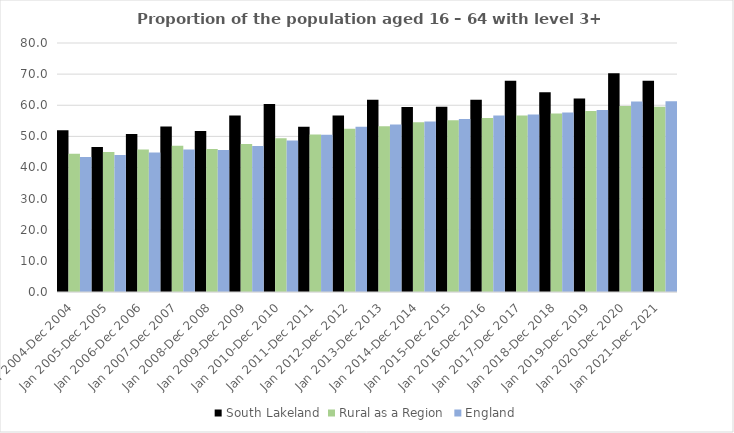
| Category | South Lakeland | Rural as a Region | England |
|---|---|---|---|
| Jan 2004-Dec 2004 | 52 | 44.405 | 43.4 |
| Jan 2005-Dec 2005 | 46.6 | 44.973 | 44 |
| Jan 2006-Dec 2006 | 50.8 | 45.774 | 44.8 |
| Jan 2007-Dec 2007 | 53.2 | 46.968 | 45.8 |
| Jan 2008-Dec 2008 | 51.7 | 45.964 | 45.6 |
| Jan 2009-Dec 2009 | 56.7 | 47.59 | 46.9 |
| Jan 2010-Dec 2010 | 60.4 | 49.362 | 48.7 |
| Jan 2011-Dec 2011 | 53.1 | 50.602 | 50.5 |
| Jan 2012-Dec 2012 | 56.7 | 52.439 | 53.1 |
| Jan 2013-Dec 2013 | 61.8 | 53.276 | 53.8 |
| Jan 2014-Dec 2014 | 59.4 | 54.57 | 54.8 |
| Jan 2015-Dec 2015 | 59.5 | 55.16 | 55.6 |
| Jan 2016-Dec 2016 | 61.8 | 55.941 | 56.7 |
| Jan 2017-Dec 2017 | 67.9 | 56.689 | 57 |
| Jan 2018-Dec 2018 | 64.2 | 57.389 | 57.7 |
| Jan 2019-Dec 2019 | 62.2 | 58.147 | 58.5 |
| Jan 2020-Dec 2020 | 70.3 | 59.771 | 61.2 |
| Jan 2021-Dec 2021 | 67.9 | 59.54 | 61.3 |